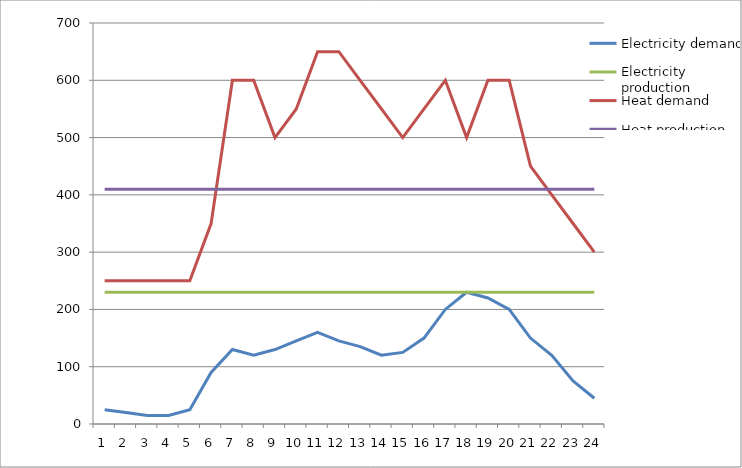
| Category | Electricity demand | Electricity production | Heat demand | Heat production |
|---|---|---|---|---|
| 0 | 25 | 230 | 250 | 410 |
| 1 | 20 | 230 | 250 | 410 |
| 2 | 15 | 230 | 250 | 410 |
| 3 | 15 | 230 | 250 | 410 |
| 4 | 25 | 230 | 250 | 410 |
| 5 | 90 | 230 | 350 | 410 |
| 6 | 130 | 230 | 600 | 410 |
| 7 | 120 | 230 | 600 | 410 |
| 8 | 130 | 230 | 500 | 410 |
| 9 | 145 | 230 | 550 | 410 |
| 10 | 160 | 230 | 650 | 410 |
| 11 | 145 | 230 | 650 | 410 |
| 12 | 135 | 230 | 600 | 410 |
| 13 | 120 | 230 | 550 | 410 |
| 14 | 125 | 230 | 500 | 410 |
| 15 | 150 | 230 | 550 | 410 |
| 16 | 200 | 230 | 600 | 410 |
| 17 | 230 | 230 | 500 | 410 |
| 18 | 220 | 230 | 600 | 410 |
| 19 | 200 | 230 | 600 | 410 |
| 20 | 150 | 230 | 450 | 410 |
| 21 | 120 | 230 | 400 | 410 |
| 22 | 75 | 230 | 350 | 410 |
| 23 | 45 | 230 | 300 | 410 |